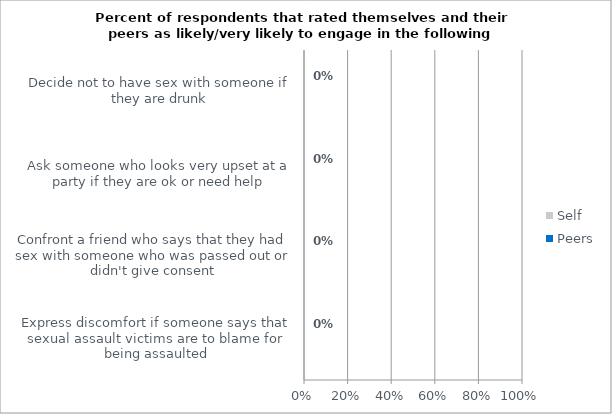
| Category | Peers | Self |
|---|---|---|
| Express discomfort if someone says that sexual assault victims are to blame for being assaulted | 0 | 0 |
| Confront a friend who says that they had sex with someone who was passed out or didn't give consent | 0 | 0 |
| Ask someone who looks very upset at a party if they are ok or need help | 0 | 0 |
| Decide not to have sex with someone if they are drunk | 0 | 0 |